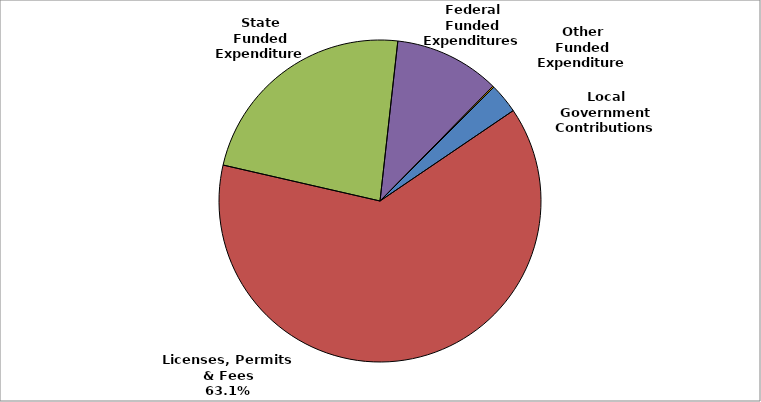
| Category | Series 0 |
|---|---|
| Local Government Contributions | 0.03 |
| Licenses, Permits & Fees | 0.631 |
| State Funded Expenditures | 0.232 |
| Federal Funded Expenditures | 0.106 |
| Other Funded Expenditures | 0.001 |